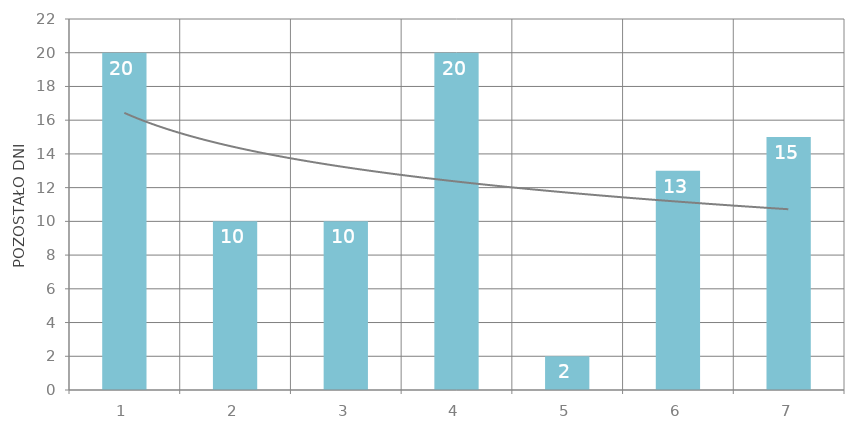
| Category | Suma |
|---|---|
| 1 | 20 |
| 2 | 10 |
| 3 | 10 |
| 4 | 20 |
| 5 | 2 |
| 6 | 13 |
| 7 | 15 |